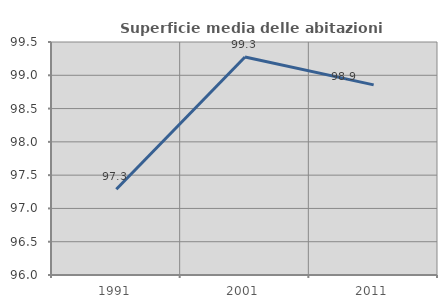
| Category | Superficie media delle abitazioni occupate |
|---|---|
| 1991.0 | 97.289 |
| 2001.0 | 99.274 |
| 2011.0 | 98.856 |